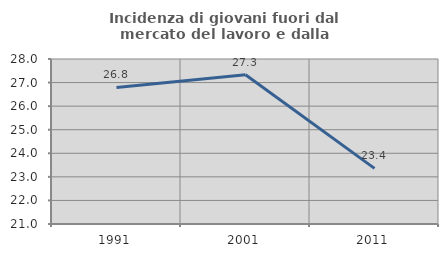
| Category | Incidenza di giovani fuori dal mercato del lavoro e dalla formazione  |
|---|---|
| 1991.0 | 26.794 |
| 2001.0 | 27.335 |
| 2011.0 | 23.359 |